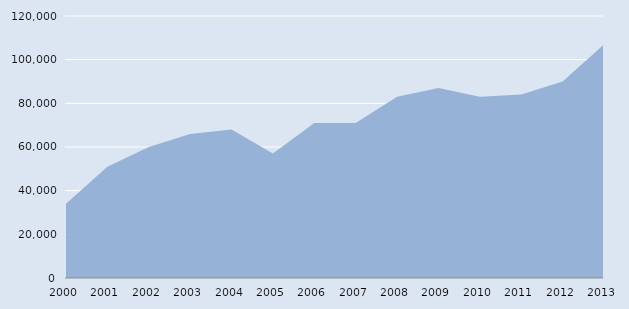
| Category | Series 0 |
|---|---|
| 2000.0 | 34000 |
| 2001.0 | 51000 |
| 2002.0 | 60000 |
| 2003.0 | 66000 |
| 2004.0 | 68000 |
| 2005.0 | 57000 |
| 2006.0 | 71000 |
| 2007.0 | 71000 |
| 2008.0 | 83000 |
| 2009.0 | 87000 |
| 2010.0 | 83000 |
| 2011.0 | 84000 |
| 2012.0 | 90000 |
| 2013.0 | 107000 |